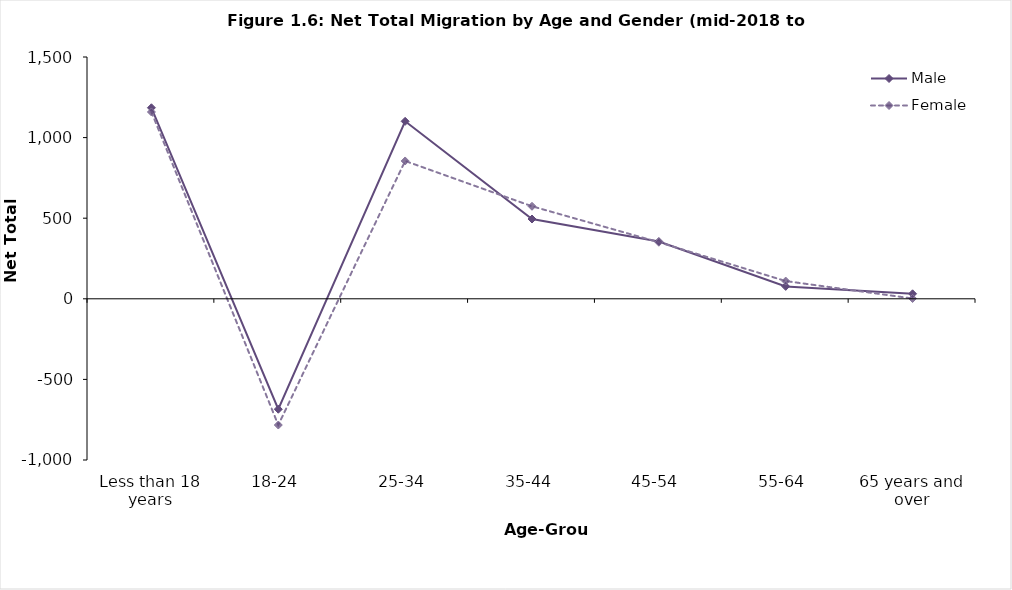
| Category | Male | Female |
|---|---|---|
| Less than 18 years | 1185 | 1159 |
| 18-24 | -685 | -783 |
| 25-34 | 1101 | 855 |
| 35-44 | 495 | 574 |
| 45-54 | 355 | 351 |
| 55-64 | 77 | 110 |
| 65 years and over | 31 | 2 |